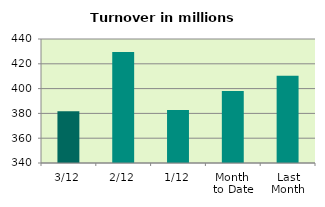
| Category | Series 0 |
|---|---|
| 3/12 | 381.74 |
| 2/12 | 429.466 |
| 1/12 | 382.696 |
| Month 
to Date | 397.968 |
| Last
Month | 410.338 |